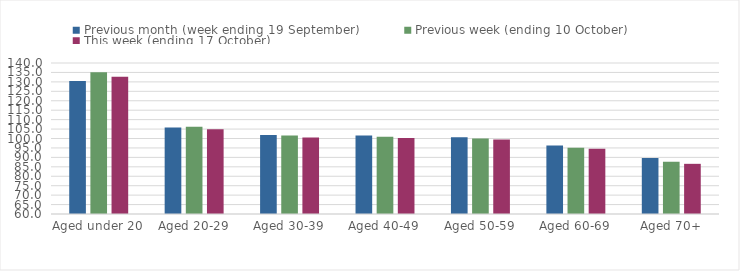
| Category | Previous month (week ending 19 September) | Previous week (ending 10 October) | This week (ending 17 October) |
|---|---|---|---|
| Aged under 20 | 130.43 | 135.08 | 132.69 |
| Aged 20-29 | 105.79 | 106.29 | 104.85 |
| Aged 30-39 | 101.91 | 101.62 | 100.54 |
| Aged 40-49 | 101.57 | 100.92 | 100.24 |
| Aged 50-59 | 100.64 | 99.96 | 99.42 |
| Aged 60-69 | 96.24 | 95.1 | 94.58 |
| Aged 70+ | 89.72 | 87.66 | 86.58 |